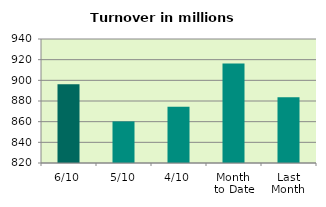
| Category | Series 0 |
|---|---|
| 6/10 | 896.252 |
| 5/10 | 860.246 |
| 4/10 | 874.471 |
| Month 
to Date | 916.275 |
| Last
Month | 883.598 |